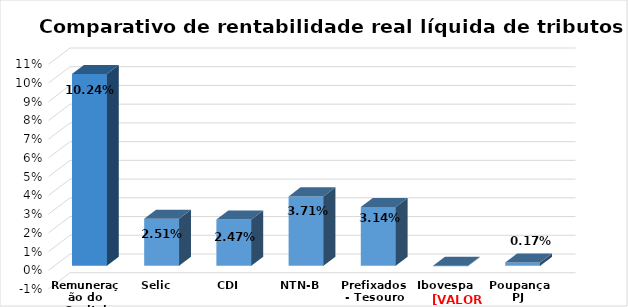
| Category | Series 0 |
|---|---|
| Remuneração do Capital Próprio | 0.102 |
| Selic | 0.025 |
| CDI | 0.025 |
| NTN-B | 0.037 |
| Prefixados - Tesouro | 0.031 |
| Ibovespa | 0 |
| Poupança PJ | 0.002 |